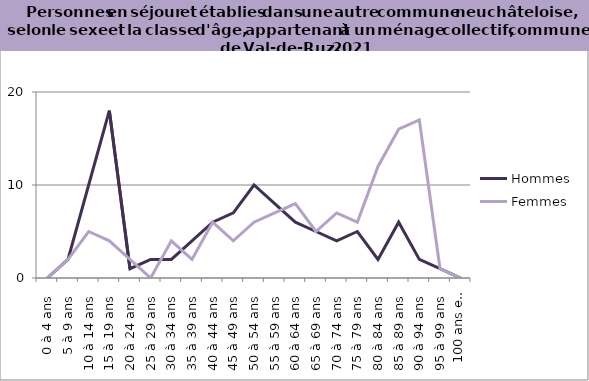
| Category | Hommes | Femmes |
|---|---|---|
| 0 à 4 ans | 0 | 0 |
| 5 à 9 ans | 2 | 2 |
| 10 à 14 ans | 10 | 5 |
| 15 à 19 ans | 18 | 4 |
| 20 à 24 ans | 1 | 2 |
| 25 à 29 ans | 2 | 0 |
| 30 à 34 ans | 2 | 4 |
| 35 à 39 ans | 4 | 2 |
| 40 à 44 ans | 6 | 6 |
| 45 à 49 ans | 7 | 4 |
| 50 à 54 ans | 10 | 6 |
| 55 à 59 ans | 8 | 7 |
| 60 à 64 ans | 6 | 8 |
| 65 à 69 ans | 5 | 5 |
| 70 à 74 ans | 4 | 7 |
| 75 à 79 ans | 5 | 6 |
| 80 à 84 ans | 2 | 12 |
| 85 à 89 ans | 6 | 16 |
| 90 à 94 ans | 2 | 17 |
| 95 à 99 ans | 1 | 1 |
| 100 ans et plus | 0 | 0 |